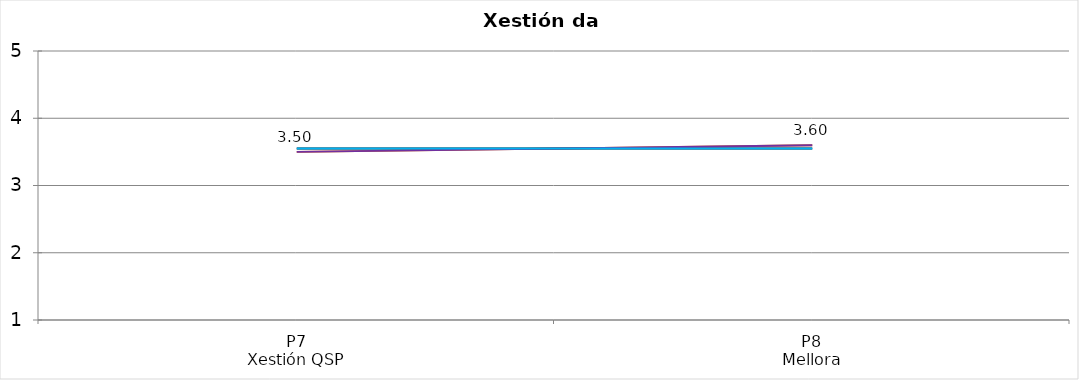
| Category | Valoración (1-5) | MEDIA |
|---|---|---|
| P7
Xestión QSP | 3.5 | 3.55 |
| P8
Mellora | 3.6 | 3.55 |